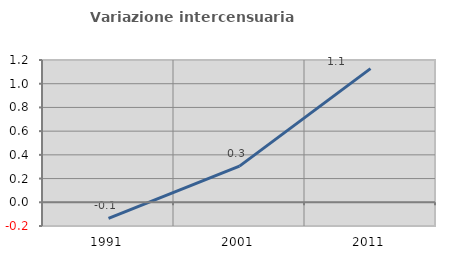
| Category | Variazione intercensuaria annua |
|---|---|
| 1991.0 | -0.136 |
| 2001.0 | 0.305 |
| 2011.0 | 1.127 |